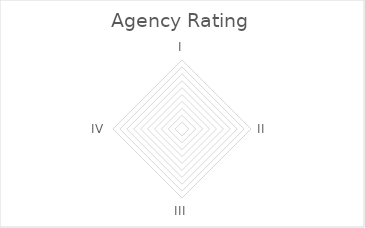
| Category | Series 0 |
|---|---|
| I | 0 |
| II | 0 |
| III | 0 |
| IV | 0 |